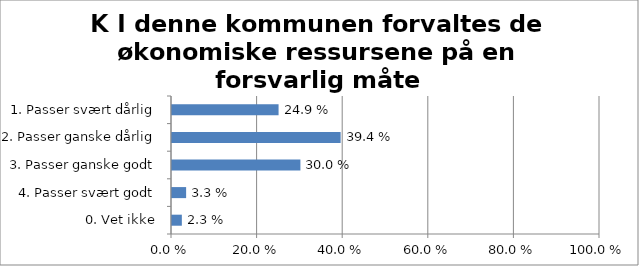
| Category | K I denne kommunen forvaltes de økonomiske ressursene på en forsvarlig måte |
|---|---|
| 1. Passer svært dårlig | 0.249 |
| 2. Passer ganske dårlig | 0.394 |
| 3. Passer ganske godt | 0.3 |
| 4. Passer svært godt | 0.033 |
| 0. Vet ikke | 0.023 |